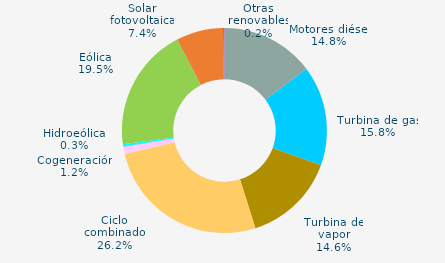
| Category | Series 0 |
|---|---|
| Motores diésel | 14.757 |
| Turbina de gas | 15.759 |
| Turbina de vapor | 14.606 |
| Ciclo combinado | 26.189 |
| Cogeneración | 1.156 |
| Hidráulica | 0.046 |
| Hidroeólica | 0.343 |
| Eólica | 19.51 |
| Solar fotovoltaica | 7.408 |
| Otras renovables | 0.225 |